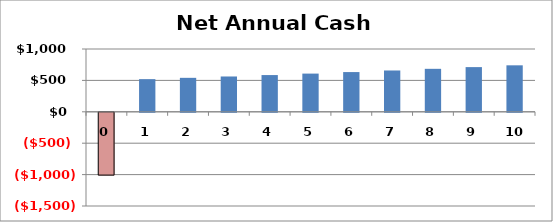
| Category | Series 1 |
|---|---|
| 0 | -1000 |
| 1 | 520 |
| 2 | 540.8 |
| 3 | 562.432 |
| 4 | 584.929 |
| 5 | 608.326 |
| 6 | 632.66 |
| 7 | 657.966 |
| 8 | 684.285 |
| 9 | 711.656 |
| 10 | 740.122 |